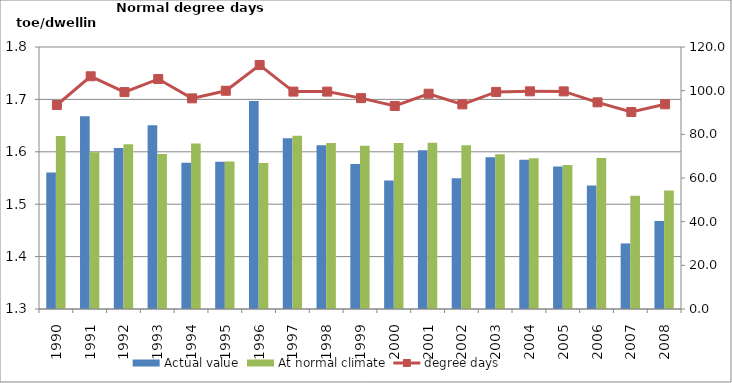
| Category | Actual value | At normal climate |
|---|---|---|
| 1990.0 | 1.56 | 1.63 |
| 1991.0 | 1.668 | 1.599 |
| 1992.0 | 1.607 | 1.614 |
| 1993.0 | 1.651 | 1.596 |
| 1994.0 | 1.579 | 1.616 |
| 1995.0 | 1.581 | 1.581 |
| 1996.0 | 1.697 | 1.579 |
| 1997.0 | 1.626 | 1.63 |
| 1998.0 | 1.612 | 1.617 |
| 1999.0 | 1.576 | 1.611 |
| 2000.0 | 1.545 | 1.617 |
| 2001.0 | 1.603 | 1.617 |
| 2002.0 | 1.549 | 1.613 |
| 2003.0 | 1.59 | 1.595 |
| 2004.0 | 1.585 | 1.588 |
| 2005.0 | 1.572 | 1.575 |
| 2006.0 | 1.536 | 1.588 |
| 2007.0 | 1.425 | 1.516 |
| 2008.0 | 1.468 | 1.526 |